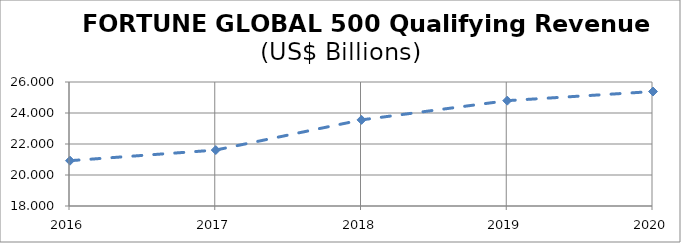
| Category | FORTUNE GLOBAL 500 QUALIFYING REVENUES |
|---|---|
| 2016.0 | 20.923 |
| 2017.0 | 21.609 |
| 2018.0 | 23.556 |
| 2019.0 | 24.796 |
| 2020.0 | 25.386 |